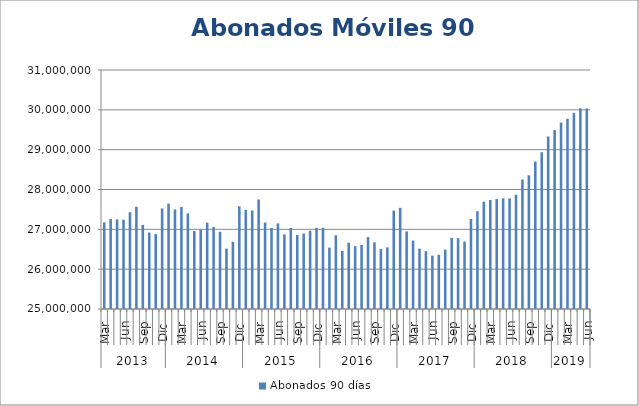
| Category | Abonados 90 días  |
|---|---|
| 0 | 27174429 |
| 1 | 27256799 |
| 2 | 27249896 |
| 3 | 27242396 |
| 4 | 27430194 |
| 5 | 27567464 |
| 6 | 27110010 |
| 7 | 26919316 |
| 8 | 26880609 |
| 9 | 27524963 |
| 10 | 27646717 |
| 11 | 27499992 |
| 12 | 27562088 |
| 13 | 27401040 |
| 14 | 26955717 |
| 15 | 26994609 |
| 16 | 27169188 |
| 17 | 27061687 |
| 18 | 26939071 |
| 19 | 26516500 |
| 20 | 26687326 |
| 21 | 27578143 |
| 22 | 27489223 |
| 23 | 27471553 |
| 24 | 27750473 |
| 25 | 27170692 |
| 26 | 27033211 |
| 27 | 27149172 |
| 28 | 26872979 |
| 29 | 27034173 |
| 30 | 26856662 |
| 31 | 26893632 |
| 32 | 26963755 |
| 33 | 27037951 |
| 34 | 27040824 |
| 35 | 26542149 |
| 36 | 26849710 |
| 37 | 26457447 |
| 38 | 26662676 |
| 39 | 26576782 |
| 40 | 26610099 |
| 41 | 26805521 |
| 42 | 26672717 |
| 43 | 26505805 |
| 44 | 26547173 |
| 45 | 27469211 |
| 46 | 27539556 |
| 47 | 26948853 |
| 48 | 26717067 |
| 49 | 26514588 |
| 50 | 26452370 |
| 51 | 26339907 |
| 52 | 26362130 |
| 53 | 26490787 |
| 54 | 26786764 |
| 55 | 26778405 |
| 56 | 26691976 |
| 57 | 27260107 |
| 58 | 27454349 |
| 59 | 27694179 |
| 60 | 27737550 |
| 61 | 27760296 |
| 62 | 27777818 |
| 63 | 27773600 |
| 64 | 27868225 |
| 65 | 28250702 |
| 66 | 28355724 |
| 67 | 28700770 |
| 68 | 28935345 |
| 69 | 29331337 |
| 70 | 29491024 |
| 71 | 29679237 |
| 72 | 29775295 |
| 73 | 29924167 |
| 74 | 30039747 |
| 75 | 30035533 |